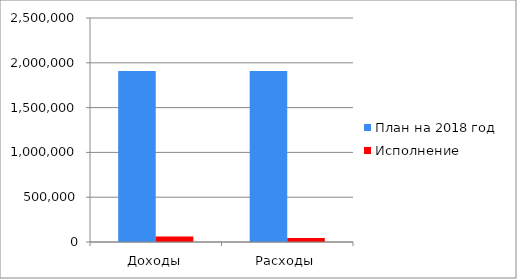
| Category | План на 2018 год | Исполнение |
|---|---|---|
| Доходы | 1909690 | 62618 |
| Расходы | 1909690 | 45371.14 |